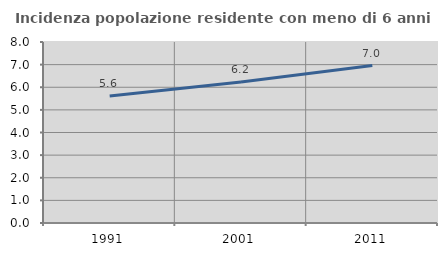
| Category | Incidenza popolazione residente con meno di 6 anni |
|---|---|
| 1991.0 | 5.617 |
| 2001.0 | 6.23 |
| 2011.0 | 6.961 |